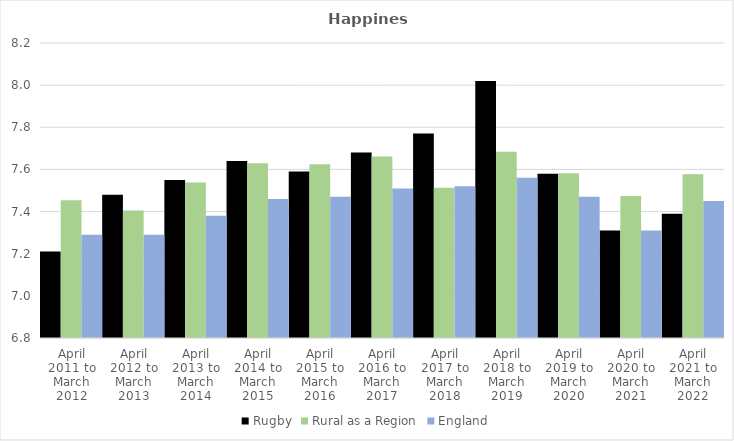
| Category | Rugby | Rural as a Region | England |
|---|---|---|---|
| April 2011 to March 2012 | 7.21 | 7.454 | 7.29 |
| April 2012 to March 2013 | 7.48 | 7.406 | 7.29 |
| April 2013 to March 2014 | 7.55 | 7.539 | 7.38 |
| April 2014 to March 2015 | 7.64 | 7.63 | 7.46 |
| April 2015 to March 2016 | 7.59 | 7.625 | 7.47 |
| April 2016 to March 2017 | 7.68 | 7.661 | 7.51 |
| April 2017 to March 2018 | 7.77 | 7.513 | 7.52 |
| April 2018 to March 2019 | 8.02 | 7.684 | 7.56 |
| April 2019 to March 2020 | 7.58 | 7.582 | 7.47 |
| April 2020 to March 2021 | 7.31 | 7.474 | 7.31 |
| April 2021 to March 2022 | 7.39 | 7.577 | 7.45 |